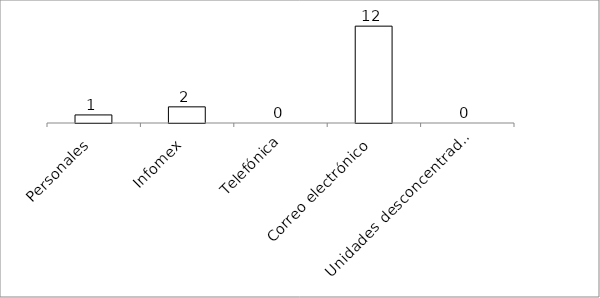
| Category | Series 0 |
|---|---|
| Personales | 1 |
| Infomex | 2 |
| Telefónica | 0 |
| Correo electrónico | 12 |
| Unidades desconcentradas | 0 |